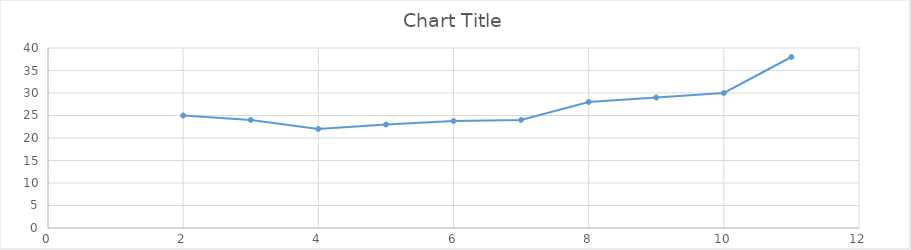
| Category | Series 0 |
|---|---|
| 2.0 | 25 |
| 3.0 | 24 |
| 4.0 | 22 |
| 5.0 | 23 |
| 6.0 | 23.8 |
| 7.0 | 24 |
| 8.0 | 28 |
| 9.0 | 29 |
| 10.0 | 30 |
| 11.0 | 38 |